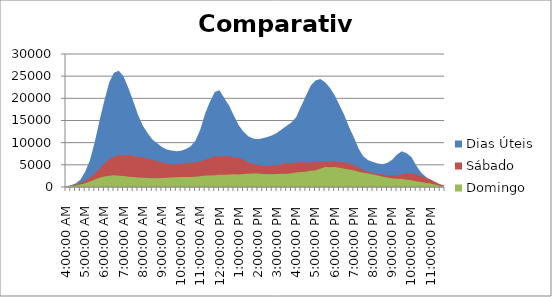
| Category | Dias Úteis | Sábado | Domingo |
|---|---|---|---|
| 0.16666666666666663 | 151 | 138 | 151 |
| 0.1770833333333333 | 382 | 302 | 230 |
| 0.18749999999999994 | 798 | 528 | 324 |
| 0.1979166666666666 | 1655.4 | 933 | 590 |
| 0.20833333333333326 | 3466.4 | 1423 | 872 |
| 0.21874999999999992 | 6086.8 | 2126 | 1235 |
| 0.22916666666666657 | 10133.8 | 3047 | 1679 |
| 0.23958333333333323 | 15059.8 | 4159 | 2112 |
| 0.2499999999999999 | 19521.2 | 5321 | 2368 |
| 0.2604166666666666 | 23592.6 | 6193 | 2557 |
| 0.27083333333333326 | 25797.2 | 6849 | 2644 |
| 0.28124999999999994 | 26205.4 | 7199 | 2521 |
| 0.29166666666666663 | 24940.4 | 7126 | 2460 |
| 0.3020833333333333 | 22333.6 | 7209 | 2333 |
| 0.3125 | 19372 | 7014 | 2257 |
| 0.3229166666666667 | 16286.4 | 6832 | 2147 |
| 0.33333333333333337 | 13900 | 6695 | 2110 |
| 0.34375000000000006 | 12173.2 | 6387 | 2029 |
| 0.35416666666666674 | 10736 | 6145 | 1981 |
| 0.3645833333333334 | 9888.2 | 5880 | 1988 |
| 0.3750000000000001 | 9035.4 | 5512 | 2021 |
| 0.3854166666666668 | 8451.2 | 5253 | 2074 |
| 0.3958333333333335 | 8255.2 | 5154 | 2135 |
| 0.40625000000000017 | 8039.8 | 5071 | 2197 |
| 0.41666666666666685 | 8167 | 5202 | 2237 |
| 0.42708333333333354 | 8597.6 | 5397 | 2230 |
| 0.4375000000000002 | 9181 | 5489 | 2240 |
| 0.4479166666666669 | 10480 | 5567 | 2331 |
| 0.4583333333333336 | 12957.4 | 5783 | 2406 |
| 0.4687500000000003 | 16565 | 6139 | 2582 |
| 0.47916666666666696 | 19254.2 | 6569 | 2615 |
| 0.48958333333333365 | 21412 | 6963 | 2633 |
| 0.5000000000000003 | 21846.4 | 6866 | 2761 |
| 0.510416666666667 | 20029 | 6937 | 2735 |
| 0.5208333333333336 | 18382 | 7006 | 2827 |
| 0.5312500000000002 | 16083.4 | 6667 | 2863 |
| 0.5416666666666669 | 13954.6 | 6667 | 2843 |
| 0.5520833333333335 | 12454.2 | 6225 | 2941 |
| 0.5625000000000001 | 11461.2 | 5554 | 2975 |
| 0.5729166666666667 | 10916 | 5317 | 3045 |
| 0.5833333333333334 | 10776.8 | 4961 | 3018 |
| 0.59375 | 10994.4 | 4734 | 2928 |
| 0.6041666666666666 | 11285.2 | 4722 | 2900 |
| 0.6145833333333333 | 11649.4 | 4835 | 2902 |
| 0.6249999999999999 | 12253.8 | 4947 | 2937 |
| 0.6354166666666665 | 13022.2 | 5152 | 2962 |
| 0.6458333333333331 | 13823.8 | 5401 | 3002 |
| 0.6562499999999998 | 14550.2 | 5422 | 3098 |
| 0.6666666666666664 | 15805.8 | 5543 | 3274 |
| 0.677083333333333 | 18208.4 | 5571 | 3381 |
| 0.6874999999999997 | 20539.4 | 5530 | 3459 |
| 0.6979166666666663 | 22860.6 | 5582 | 3665 |
| 0.7083333333333329 | 24036.4 | 5653 | 3742 |
| 0.7187499999999996 | 24349.6 | 5779 | 4126 |
| 0.7291666666666662 | 23630.4 | 5755 | 4495 |
| 0.7395833333333328 | 22401.6 | 5746 | 4478 |
| 0.7499999999999994 | 20692.4 | 5820 | 4504 |
| 0.7604166666666661 | 18510.4 | 5665 | 4352 |
| 0.7708333333333327 | 16244 | 5591 | 4109 |
| 0.7812499999999993 | 13562 | 5375 | 3935 |
| 0.791666666666666 | 11197.8 | 4925 | 3701 |
| 0.8020833333333326 | 8636.6 | 4374 | 3414 |
| 0.8124999999999992 | 6905.8 | 3837 | 3210 |
| 0.8229166666666659 | 6048 | 3481 | 3033 |
| 0.8333333333333325 | 5615 | 3176 | 2835 |
| 0.8437499999999991 | 5274.6 | 2967 | 2611 |
| 0.8541666666666657 | 5118.8 | 2903 | 2324 |
| 0.8645833333333324 | 5487 | 2720 | 2152 |
| 0.874999999999999 | 6147.2 | 2586 | 1927 |
| 0.8854166666666656 | 7345 | 2732 | 1840 |
| 0.8958333333333323 | 8044 | 2900 | 1801 |
| 0.9062499999999989 | 7640.2 | 3078 | 1639 |
| 0.9166666666666655 | 6768.6 | 3121 | 1496 |
| 0.9270833333333321 | 4833.8 | 2855 | 1311 |
| 0.9374999999999988 | 3260.6 | 2492 | 1103 |
| 0.9479166666666654 | 2316 | 2013 | 895 |
| 0.958333333333332 | 1524.4 | 1675 | 776 |
| 0.9687499999999987 | 913.8 | 1130 | 525 |
| 0.9791666666666653 | 528.4 | 636 | 293 |
| 0.9895833333333319 | 204.2 | 262 | 130 |